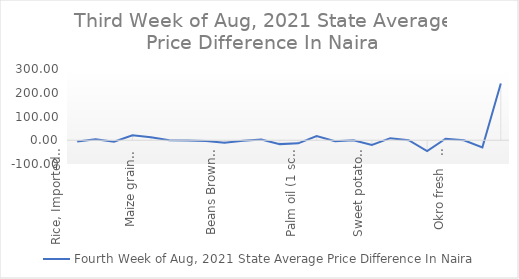
| Category | Fourth Week of Aug, 2021 |
|---|---|
| Rice, Imported, High Quality Sold loose  (1 mudu) | -5.652 |
| Rice, Agric Sold Loose(Low quality) imported  (1 mudu) | 4.348 |
| Rice Local, Sold Loose   (1 mudu) | -6.087 |
| Maize grain, white sold loose   (1 mudu) | 20.87 |
| Maize grain, yellow sold loose   (1 mudu) | 12.826 |
| Sorghum (Guinea Corn) white or brown, sold loose   (1 mudu) | -0.217 |
| millet (jero or maiwa) sold loose   (1 mudu) | -0.652 |
| Beans: white black eye. Sold loose   (1 mudu) | -3.043 |
| Beans Brown, sold loose  (1 mudu) | -10.87 |
| Soya Beans, sold loose    (1 mudu) | -1.739 |
| Gari White, sold loose  (1 mudu) | 3.478 |
| Gari Yellow, sold loose   (1 mudu) | -16.304 |
| Palm oil (1 schnap bottle) | -13.043 |
| Yam tuber (1 Medium Size) | 17.391 |
| Cassava tuber | -4.348 |
| Irish potato  (4 Litre rubber) | 0 |
| Sweet potato  (5 Medium Size) | -19.565 |
| Local live chicken  | 8.696 |
| Groundnut - shelled (fresh) | 0 |
| Tomato fresh   (4 Litre rubber) | -45.652 |
| Okro fresh     (1 mudu) | 6.522 |
| Okro dried    (1 mudu) | 0 |
| Onion   (4 Litre rubber) | -30.435 |
| Pepper fresh   (4 Litre rubber) | 239.13 |